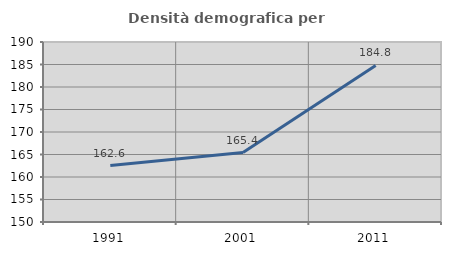
| Category | Densità demografica |
|---|---|
| 1991.0 | 162.553 |
| 2001.0 | 165.423 |
| 2011.0 | 184.796 |